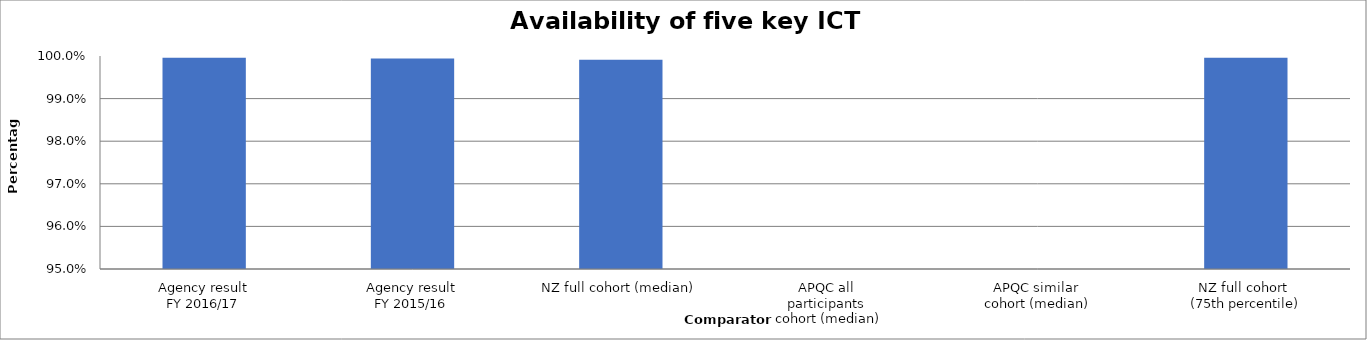
| Category | Result |
|---|---|
| Agency result
FY 2016/17 | 1 |
| Agency result
FY 2015/16 | 0.999 |
| NZ full cohort (median) | 0.999 |
| APQC all 
participants 
cohort (median) | 0 |
| APQC similar 
cohort (median) | 0 |
| NZ full cohort 
(75th percentile) | 1 |